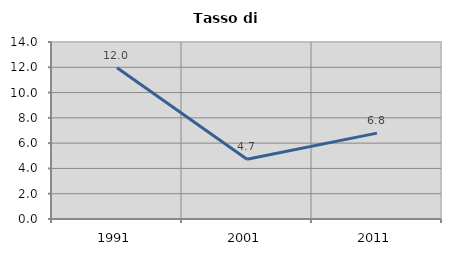
| Category | Tasso di disoccupazione   |
|---|---|
| 1991.0 | 11.957 |
| 2001.0 | 4.724 |
| 2011.0 | 6.792 |